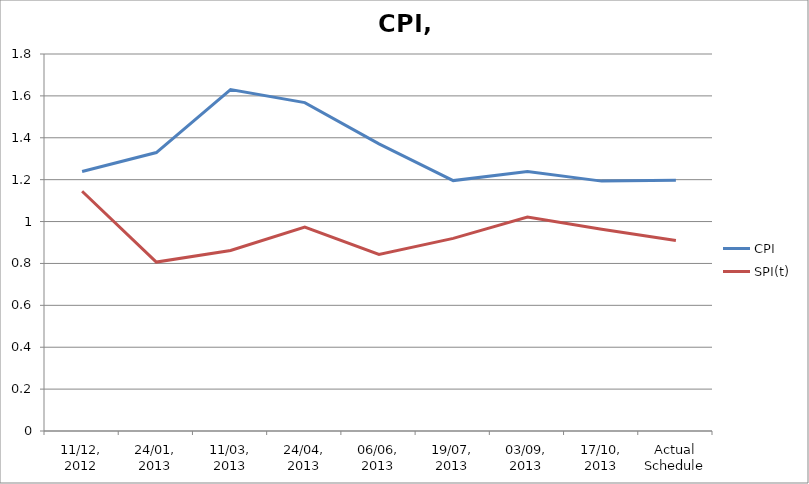
| Category | CPI | SPI(t) |
|---|---|---|
| 11/12, 2012 | 1.239 | 1.145 |
| 24/01, 2013 | 1.33 | 0.807 |
| 11/03, 2013 | 1.63 | 0.862 |
| 24/04, 2013 | 1.568 | 0.974 |
| 06/06, 2013 | 1.371 | 0.843 |
| 19/07, 2013 | 1.196 | 0.92 |
| 03/09, 2013 | 1.239 | 1.022 |
| 17/10, 2013 | 1.193 | 0.963 |
| Actual Schedule | 1.197 | 0.909 |